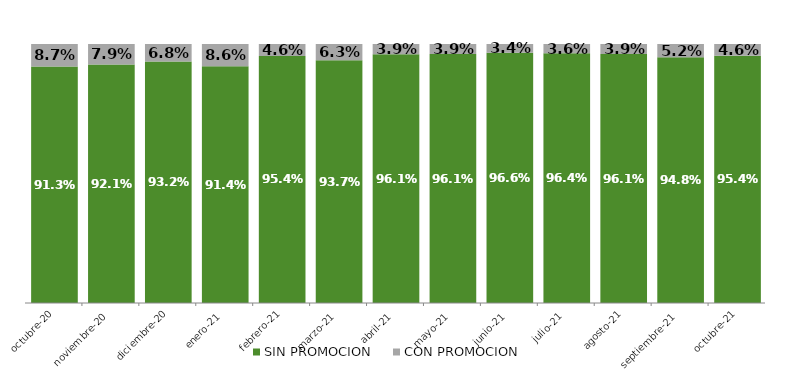
| Category | SIN PROMOCION   | CON PROMOCION   |
|---|---|---|
| 2020-10-01 | 0.913 | 0.087 |
| 2020-11-01 | 0.921 | 0.079 |
| 2020-12-01 | 0.932 | 0.068 |
| 2021-01-01 | 0.914 | 0.086 |
| 2021-02-01 | 0.954 | 0.046 |
| 2021-03-01 | 0.937 | 0.063 |
| 2021-04-01 | 0.961 | 0.039 |
| 2021-05-01 | 0.961 | 0.039 |
| 2021-06-01 | 0.966 | 0.034 |
| 2021-07-01 | 0.964 | 0.036 |
| 2021-08-01 | 0.961 | 0.039 |
| 2021-09-01 | 0.948 | 0.052 |
| 2021-10-01 | 0.954 | 0.046 |